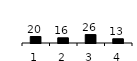
| Category | Series 0 |
|---|---|
| 1.0 | 20 |
| 2.0 | 16 |
| 3.0 | 26 |
| 4.0 | 13 |